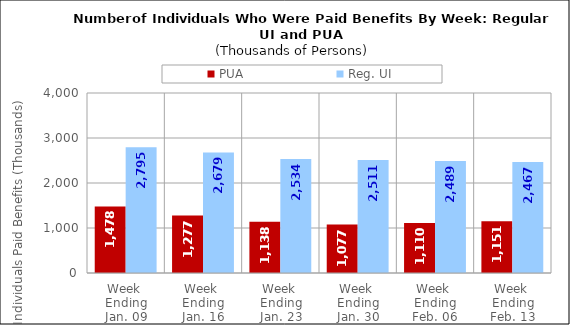
| Category | PUA | Reg. UI |
|---|---|---|
| Week 
Ending
Jan. 09 | 1478 | 2795 |
| Week 
Ending
Jan. 16 | 1277 | 2679 |
| Week 
Ending
Jan. 23 | 1138 | 2534 |
| Week 
Ending
Jan. 30 | 1077 | 2511 |
| Week 
Ending
Feb. 06 | 1110 | 2489 |
| Week 
Ending
Feb. 13 | 1151 | 2467 |